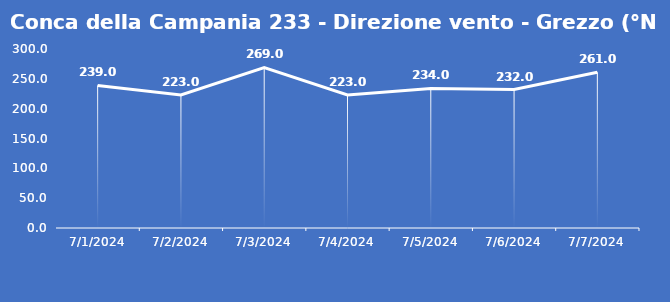
| Category | Conca della Campania 233 - Direzione vento - Grezzo (°N) |
|---|---|
| 7/1/24 | 239 |
| 7/2/24 | 223 |
| 7/3/24 | 269 |
| 7/4/24 | 223 |
| 7/5/24 | 234 |
| 7/6/24 | 232 |
| 7/7/24 | 261 |